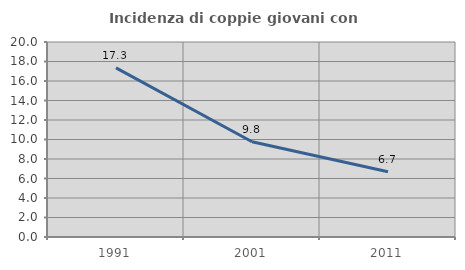
| Category | Incidenza di coppie giovani con figli |
|---|---|
| 1991.0 | 17.345 |
| 2001.0 | 9.772 |
| 2011.0 | 6.687 |